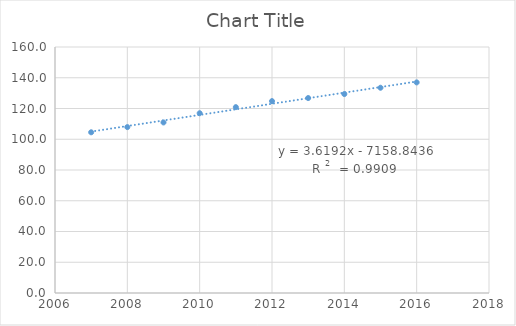
| Category | Series 0 |
|---|---|
| 2007.0 | 104.525 |
| 2008.0 | 107.9 |
| 2009.0 | 110.925 |
| 2010.0 | 116.925 |
| 2011.0 | 120.875 |
| 2012.0 | 124.8 |
| 2013.0 | 126.8 |
| 2014.0 | 129.4 |
| 2015.0 | 133.5 |
| 2016.0 | 136.975 |